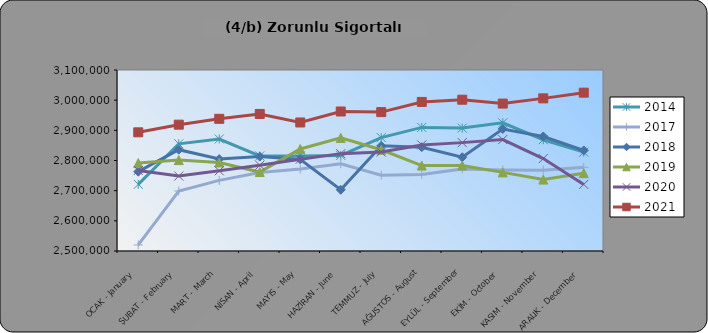
| Category | 2014 | 2017 | 2018 | 2019 | 2020 | 2021 |
|---|---|---|---|---|---|---|
| OCAK - January |  |  | 2762901 | 2791418 | 2766914 | 2893394 |
| ŞUBAT - February |  |  | 2835795 | 2801378 | 2748447 | 2918795 |
| MART - March |  |  | 2804909 | 2793511 | 2765787 | 2938150 |
| NİSAN - April |  |  | 2812961 | 2761695 | 2784393 | 2954314 |
| MAYIS - May |  |  | 2803693 | 2838167 | 2804352 | 2926067 |
| HAZİRAN - June |  |  | 2702964 | 2874942 | 2822772 | 2962449 |
| TEMMUZ - July |  |  | 2848614 | 2835662 | 2828024 | 2960383 |
| AĞUSTOS - August |  |  | 2844133 | 2783315 | 2851542 | 2994151 |
| EYLÜL - September |  |  | 2810852 | 2783328 | 2859258 | 3001496 |
| EKİM - October |  |  | 2904436 | 2760621 | 2869425 | 2988675 |
| KASIM - November |  |  | 2879630 | 2736801 | 2806449 | 3005949 |
| ARALIK - December |  |  | 2833299 | 2758067 | 2720780 | 3024877 |